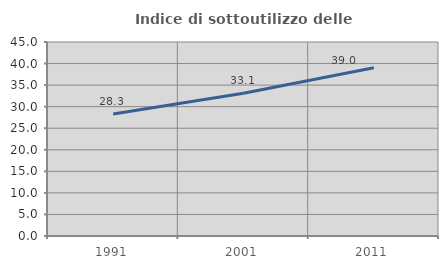
| Category | Indice di sottoutilizzo delle abitazioni  |
|---|---|
| 1991.0 | 28.276 |
| 2001.0 | 33.134 |
| 2011.0 | 39.024 |